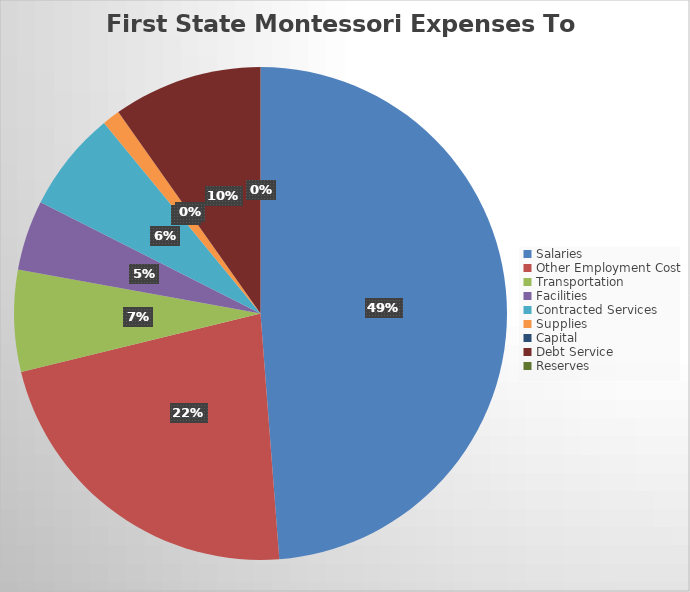
| Category | Series 0 |
|---|---|
| Salaries | 3833645.26 |
| Other Employment Cost | 1760264.52 |
| Transportation | 524127.87 |
| Facilities | 361666.44 |
| Contracted Services | 518628.32 |
| Supplies | 91199.6 |
| Capital | 0 |
| Debt Service | 768822.52 |
| Reserves | 0 |